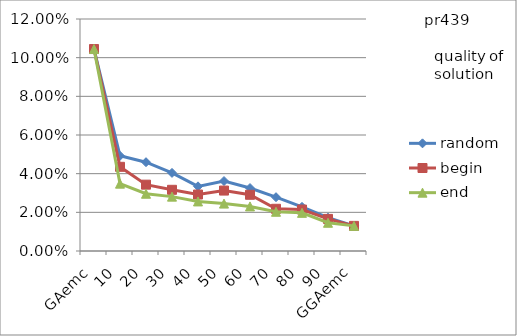
| Category | random | begin | end |
|---|---|---|---|
| 0 | 0.104 | 0.104 | 0.104 |
| 1 | 0.049 | 0.044 | 0.035 |
| 2 | 0.046 | 0.034 | 0.03 |
| 3 | 0.04 | 0.032 | 0.028 |
| 4 | 0.033 | 0.029 | 0.026 |
| 5 | 0.036 | 0.031 | 0.025 |
| 6 | 0.033 | 0.029 | 0.023 |
| 7 | 0.028 | 0.022 | 0.02 |
| 8 | 0.023 | 0.021 | 0.02 |
| 9 | 0.017 | 0.017 | 0.015 |
| 10 | 0.013 | 0.013 | 0.013 |